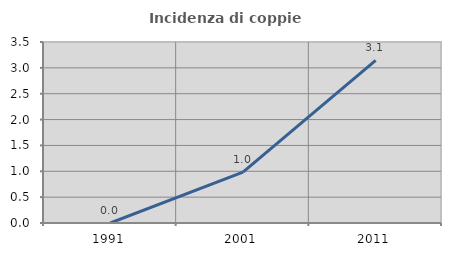
| Category | Incidenza di coppie miste |
|---|---|
| 1991.0 | 0 |
| 2001.0 | 0.984 |
| 2011.0 | 3.143 |